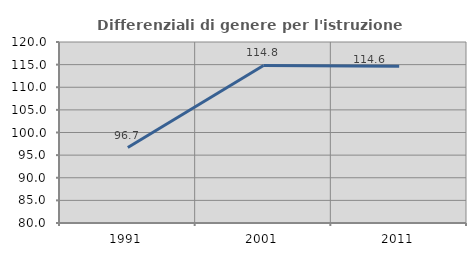
| Category | Differenziali di genere per l'istruzione superiore |
|---|---|
| 1991.0 | 96.671 |
| 2001.0 | 114.817 |
| 2011.0 | 114.635 |